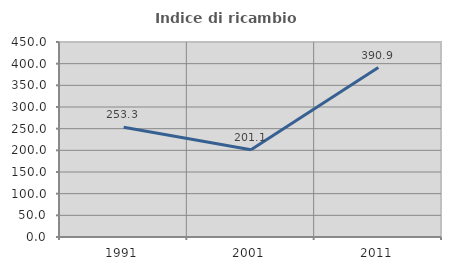
| Category | Indice di ricambio occupazionale  |
|---|---|
| 1991.0 | 253.333 |
| 2001.0 | 201.136 |
| 2011.0 | 390.909 |